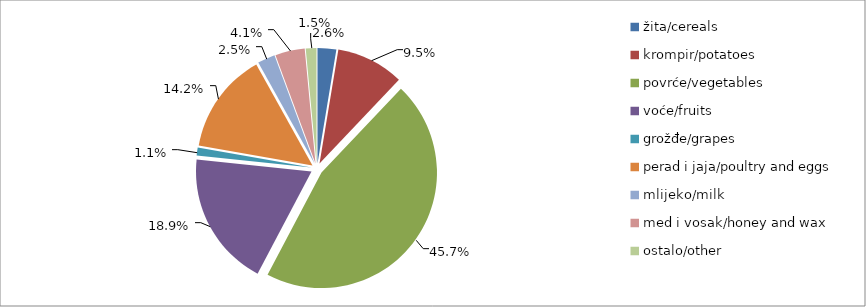
| Category | Series 0 |
|---|---|
| žita/cereals | 41957 |
| krompir/potatoes | 151702 |
| povrće/vegetables | 732656 |
| voće/fruits | 303694 |
| grožđe/grapes | 17474 |
| perad i jaja/poultry and eggs | 227100 |
| mlijeko/milk | 39474 |
| med i vosak/honey and wax | 66407 |
| ostalo/other | 23955 |